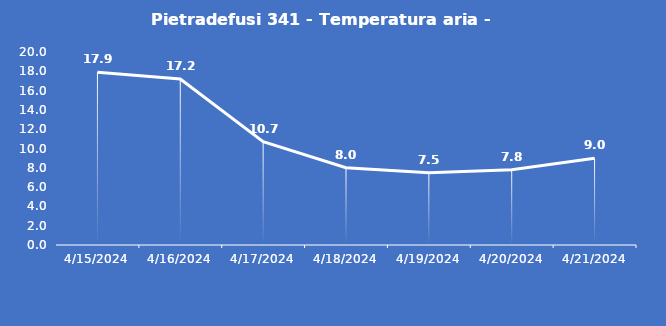
| Category | Pietradefusi 341 - Temperatura aria - Grezzo (°C) |
|---|---|
| 4/15/24 | 17.9 |
| 4/16/24 | 17.2 |
| 4/17/24 | 10.7 |
| 4/18/24 | 8 |
| 4/19/24 | 7.5 |
| 4/20/24 | 7.8 |
| 4/21/24 | 9 |